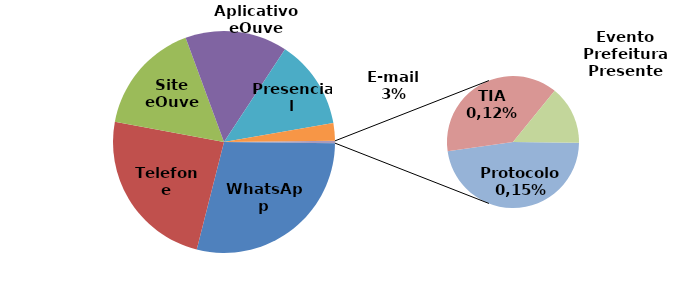
| Category | Series 0 |
|---|---|
| WhatsApp | 1868 |
| Telefone | 1555 |
| Site eOuve | 1068 |
| Aplicativo eOuve | 966 |
| Presencial | 843 |
| E-mail | 167 |
| Protocolo | 10 |
| TIA | 8 |
| Evento Prefeitura Presente | 3 |